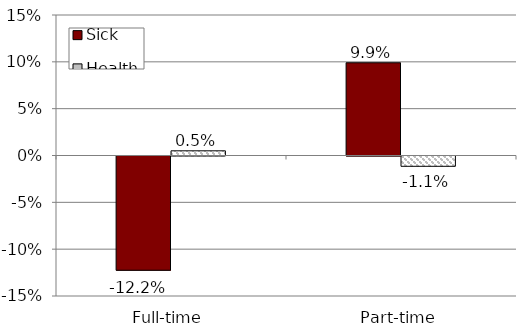
| Category | Sick | Healthy |
|---|---|---|
| Full-time | -0.122 | 0.005 |
| Part-time | 0.099 | -0.011 |